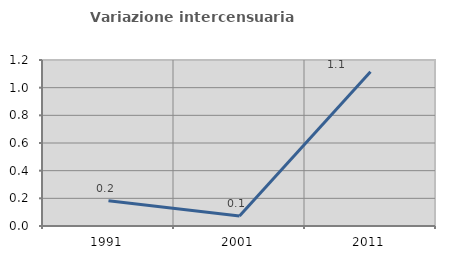
| Category | Variazione intercensuaria annua |
|---|---|
| 1991.0 | 0.183 |
| 2001.0 | 0.072 |
| 2011.0 | 1.116 |